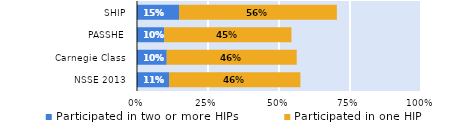
| Category | Participated in two or more HIPs | Participated in one HIP |
|---|---|---|
| NSSE 2013 | 0.113 | 0.462 |
| Carnegie Class | 0.105 | 0.458 |
| PASSHE | 0.096 | 0.447 |
| SHIP | 0.148 | 0.556 |